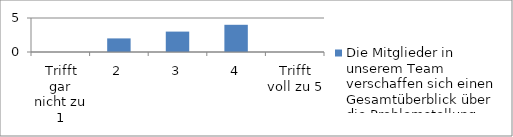
| Category | Die Mitglieder in unserem Team verschaffen sich einen Gesamtüberblick über die Problemstellung. |
|---|---|
| Trifft gar nicht zu 1 | 0 |
| 2 | 2 |
| 3 | 3 |
| 4 | 4 |
| Trifft voll zu 5 | 0 |